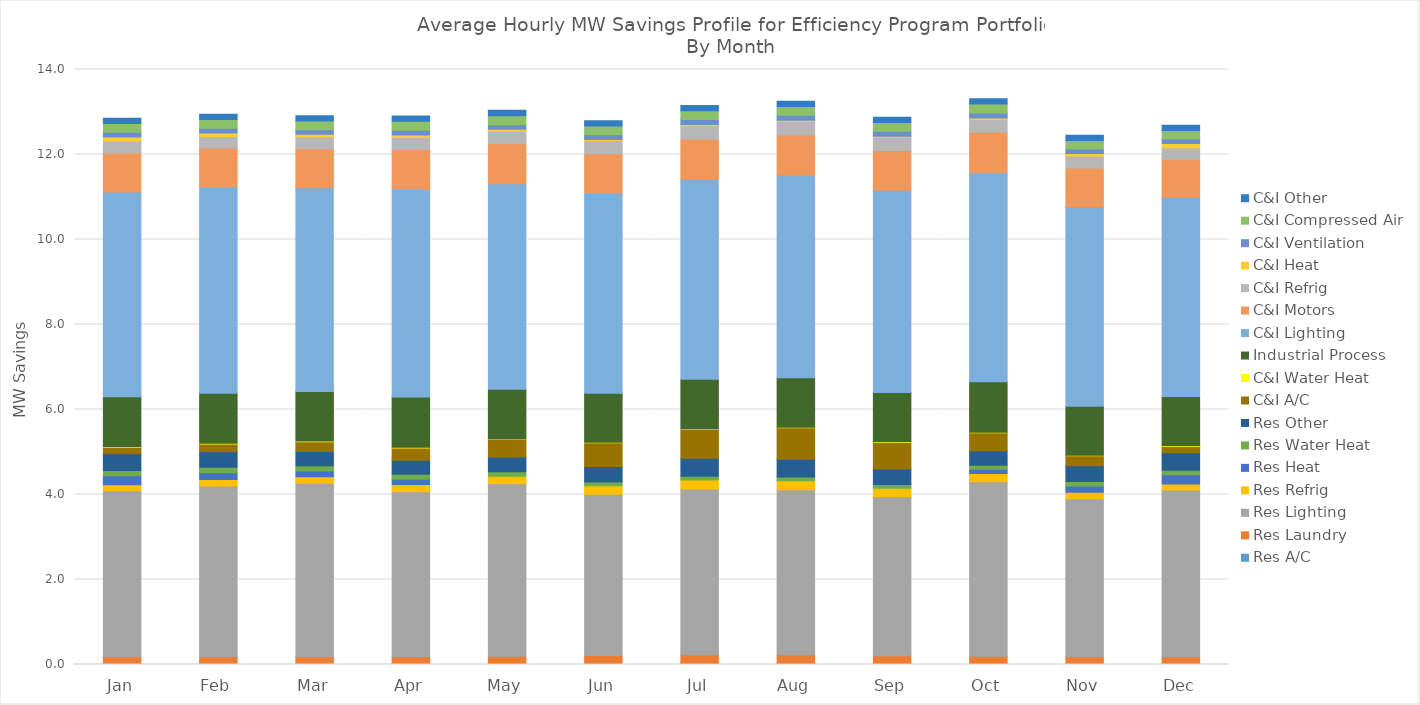
| Category | Res A/C | Res Laundry | Res Lighting | Res Refrig | Res Heat | Res Water Heat | Res Other | C&I A/C | C&I Water Heat | Industrial Process | C&I Lighting | C&I Motors | C&I Refrig | C&I Heat | C&I Ventilation | C&I Compressed Air | C&I Other |
|---|---|---|---|---|---|---|---|---|---|---|---|---|---|---|---|---|---|
| Jan | 0.006 | 0.178 | 3.904 | 0.14 | 0.215 | 0.122 | 0.39 | 0.151 | 0.017 | 1.175 | 4.818 | 0.92 | 0.271 | 0.105 | 0.109 | 0.206 | 0.124 |
| Feb | 0.004 | 0.179 | 4.019 | 0.148 | 0.164 | 0.126 | 0.368 | 0.182 | 0.018 | 1.175 | 4.843 | 0.925 | 0.275 | 0.084 | 0.109 | 0.207 | 0.124 |
| Mar | 0.004 | 0.18 | 4.079 | 0.154 | 0.139 | 0.122 | 0.337 | 0.229 | 0.018 | 1.164 | 4.794 | 0.915 | 0.279 | 0.064 | 0.107 | 0.206 | 0.123 |
| Apr | 0.006 | 0.182 | 3.88 | 0.166 | 0.128 | 0.115 | 0.33 | 0.287 | 0.017 | 1.186 | 4.882 | 0.939 | 0.286 | 0.056 | 0.11 | 0.212 | 0.124 |
| May | 0.011 | 0.185 | 4.055 | 0.179 | 0 | 0.108 | 0.342 | 0.412 | 0.017 | 1.17 | 4.835 | 0.947 | 0.296 | 0.039 | 0.111 | 0.209 | 0.124 |
| Jun | 0.021 | 0.191 | 3.792 | 0.199 | 0 | 0.093 | 0.362 | 0.557 | 0.015 | 1.148 | 4.705 | 0.935 | 0.304 | 0.031 | 0.114 | 0.203 | 0.122 |
| Jul | 0.033 | 0.198 | 3.896 | 0.214 | 0 | 0.087 | 0.421 | 0.684 | 0.014 | 1.161 | 4.706 | 0.944 | 0.318 | 0.027 | 0.117 | 0.206 | 0.122 |
| Aug | 0.031 | 0.197 | 3.884 | 0.211 | 0 | 0.091 | 0.418 | 0.737 | 0.014 | 1.167 | 4.761 | 0.947 | 0.32 | 0.026 | 0.12 | 0.208 | 0.123 |
| Sep | 0.018 | 0.186 | 3.742 | 0.199 | 0 | 0.092 | 0.362 | 0.633 | 0.014 | 1.155 | 4.76 | 0.931 | 0.313 | 0.027 | 0.116 | 0.204 | 0.123 |
| Oct | 0.011 | 0.184 | 4.108 | 0.192 | 0.102 | 0.091 | 0.343 | 0.423 | 0.014 | 1.187 | 4.919 | 0.951 | 0.301 | 0.037 | 0.113 | 0.215 | 0.126 |
| Nov | 0.004 | 0.178 | 3.718 | 0.154 | 0.149 | 0.105 | 0.369 | 0.235 | 0.015 | 1.151 | 4.701 | 0.902 | 0.285 | 0.058 | 0.105 | 0.203 | 0.122 |
| Dec | 0.006 | 0.177 | 3.923 | 0.139 | 0.22 | 0.106 | 0.414 | 0.15 | 0.016 | 1.153 | 4.687 | 0.897 | 0.272 | 0.099 | 0.106 | 0.199 | 0.121 |